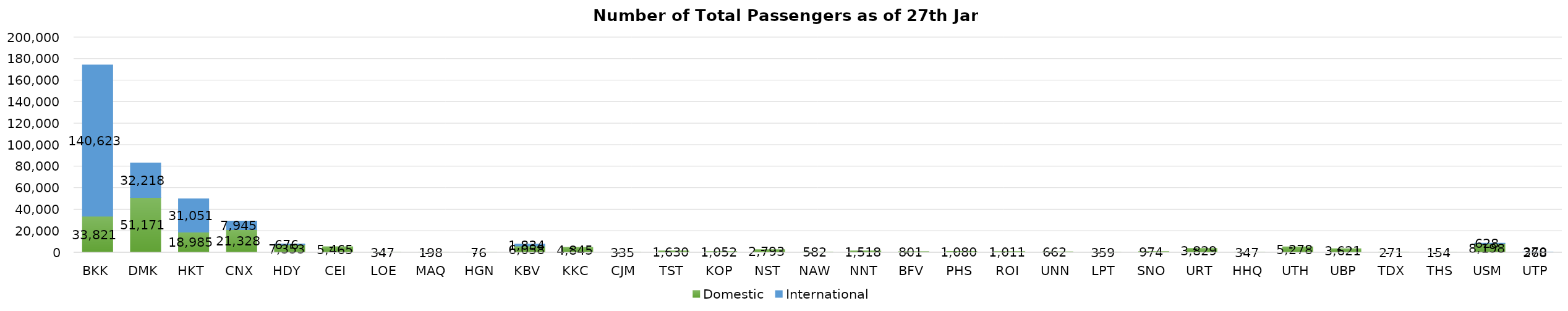
| Category | Domestic | International |
|---|---|---|
| BKK | 33821 | 140623 |
| DMK | 51171 | 32218 |
| HKT | 18985 | 31051 |
| CNX | 21328 | 7945 |
| HDY | 7353 | 676 |
| CEI | 5465 | 0 |
| LOE | 347 | 0 |
| MAQ | 198 | 0 |
| HGN | 76 | 0 |
| KBV | 6058 | 1834 |
| KKC | 4845 | 0 |
| CJM | 335 | 0 |
| TST | 1630 | 0 |
| KOP | 1052 | 0 |
| NST | 2793 | 0 |
| NAW | 582 | 0 |
| NNT | 1518 | 0 |
| BFV | 801 | 0 |
| PHS | 1080 | 0 |
| ROI | 1011 | 0 |
| UNN | 662 | 0 |
| LPT | 359 | 0 |
| SNO | 974 | 0 |
| URT | 3829 | 0 |
| HHQ | 347 | 0 |
| UTH | 5278 | 0 |
| UBP | 3621 | 0 |
| TDX | 271 | 0 |
| THS | 154 | 0 |
| USM | 8198 | 628 |
| UTP | 268 | 370 |